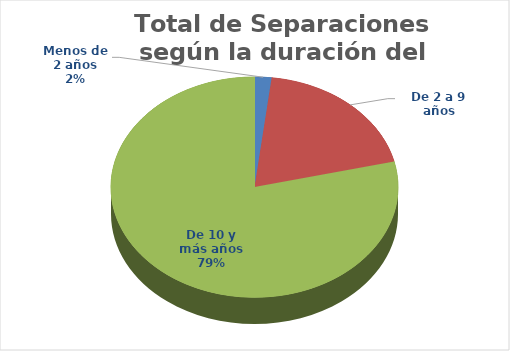
| Category | Series 0 |
|---|---|
| Menos de 2 años | 53 |
| De 2 a 9 años | 537 |
| De 10 y más años | 2185 |